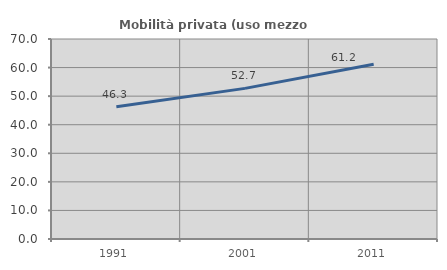
| Category | Mobilità privata (uso mezzo privato) |
|---|---|
| 1991.0 | 46.311 |
| 2001.0 | 52.717 |
| 2011.0 | 61.168 |